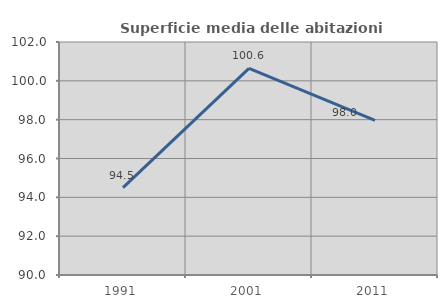
| Category | Superficie media delle abitazioni occupate |
|---|---|
| 1991.0 | 94.504 |
| 2001.0 | 100.645 |
| 2011.0 | 97.965 |